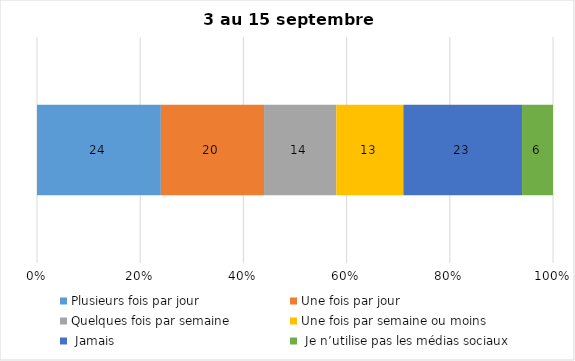
| Category | Plusieurs fois par jour | Une fois par jour | Quelques fois par semaine   | Une fois par semaine ou moins   |  Jamais   |  Je n’utilise pas les médias sociaux |
|---|---|---|---|---|---|---|
| 0 | 24 | 20 | 14 | 13 | 23 | 6 |